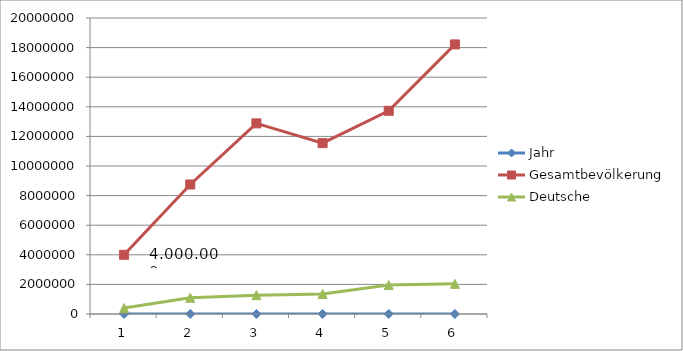
| Category | Jahr | Gesamtbevölkerung | Deutsche |
|---|---|---|---|
| 0 | 1720 | 4000000 | 400000 |
| 1 | 1805 | 8750000 | 1100000 |
| 2 | 1840 | 12880406 | 1273677 |
| 3 | 1851 | 11544000 | 1356652 |
| 4 | 1880 | 13729000 | 1953911 |
| 5 | 1910 | 18215000 | 2037435 |